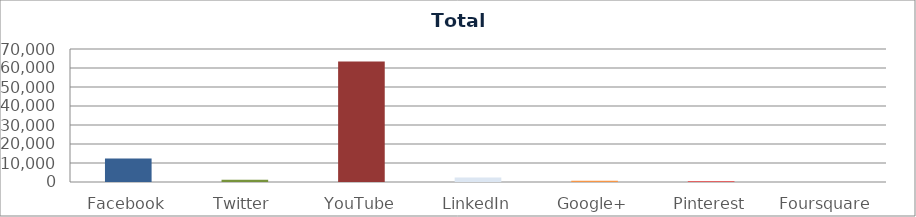
| Category | Series 0 |
|---|---|
| Facebook | 12345 |
| Twitter | 1234 |
| YouTube | 63426 |
| LinkedIn | 2355 |
| Google+ | 643 |
| Pinterest | 234 |
| Foursquare | 12 |